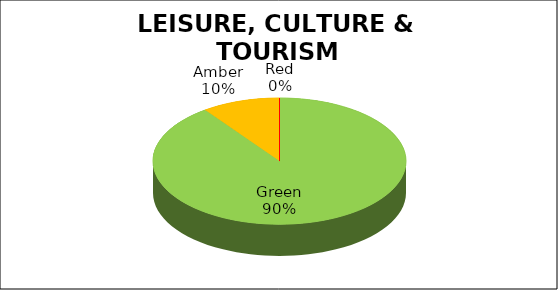
| Category | Q1 |
|---|---|
| Green | 0.9 |
| Amber | 0.1 |
| Red | 0 |